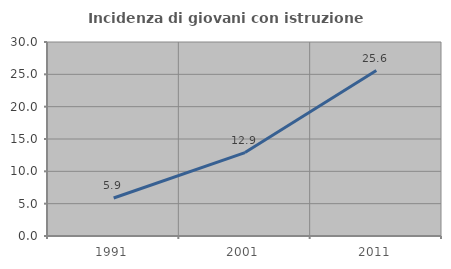
| Category | Incidenza di giovani con istruzione universitaria |
|---|---|
| 1991.0 | 5.882 |
| 2001.0 | 12.903 |
| 2011.0 | 25.581 |